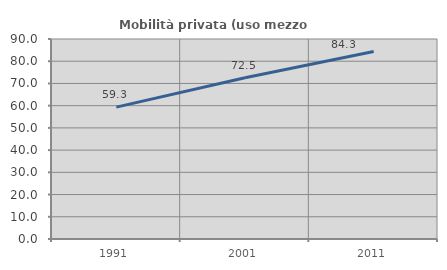
| Category | Mobilità privata (uso mezzo privato) |
|---|---|
| 1991.0 | 59.349 |
| 2001.0 | 72.538 |
| 2011.0 | 84.34 |